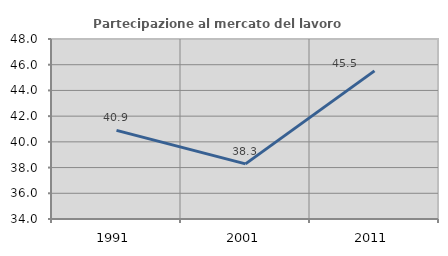
| Category | Partecipazione al mercato del lavoro  femminile |
|---|---|
| 1991.0 | 40.894 |
| 2001.0 | 38.287 |
| 2011.0 | 45.52 |